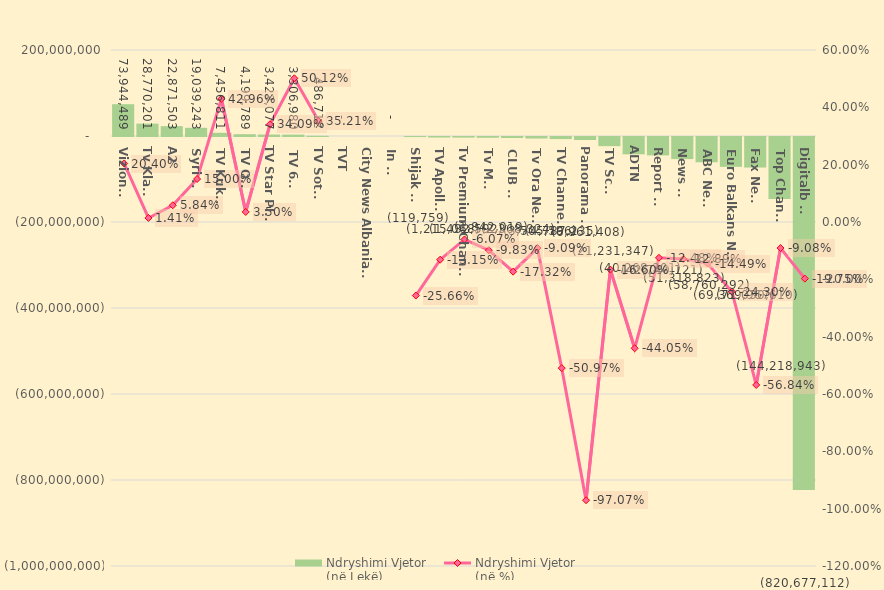
| Category | Ndryshimi Vjetor
(në Lekë) |
|---|---|
| Vizion + | 73944489 |
| Tv Klan  | 28770201 |
| A2 | 22871503 |
| Syri Tv | 19039243 |
| TV Kukësi | 7456811 |
| TV Ora | 4199789 |
| TV Star Plus | 3423077 |
| TV 6+1 | 3306980 |
| TV Sot 7 | 486712 |
| TVT | 0 |
| City News Albania HD | 0 |
| In Tv | 0 |
| Shijak Tv | -119759 |
| TV Apollon | -1215068 |
| Tv Premium Channel | -1432592 |
| Tv Mati | -1842019 |
| CLUB TV | -2368324 |
| Tv Ora News | -3505596 |
| TV Channel 1 | -4787235 |
| Panorama Tv | -6961408 |
| TV Scan | -21231347 |
| ADTN | -40268301 |
| Report Tv | -42740121 |
| News 24 | -51318823 |
| ABC News | -58760292 |
| Euro Balkans News | -69369967 |
| Fax News | -71030610 |
| Top Channel | -144218943 |
| Digitalb TV | -820677112 |